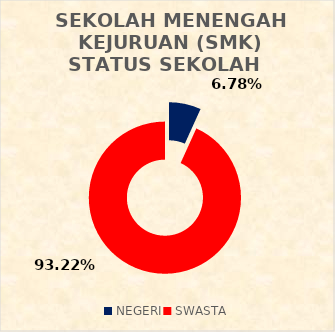
| Category | SEKOLAH MENENGAH KEJURUAN (SMK) STATUS SEKOLAH |
|---|---|
| NEGERI | 4 |
| SWASTA | 55 |